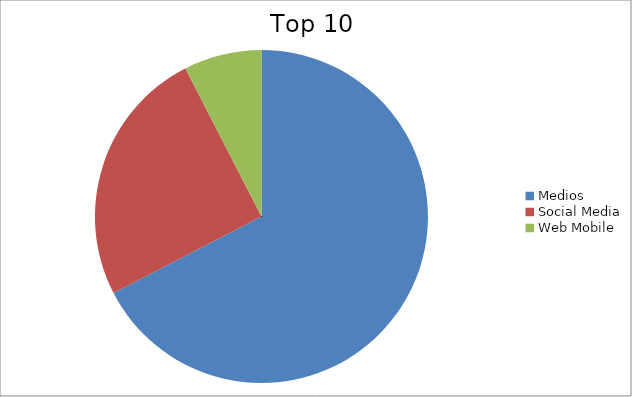
| Category | Series 0 |
|---|---|
| Medios | 67.41 |
| Social Media | 25.04 |
| Web Mobile | 7.55 |